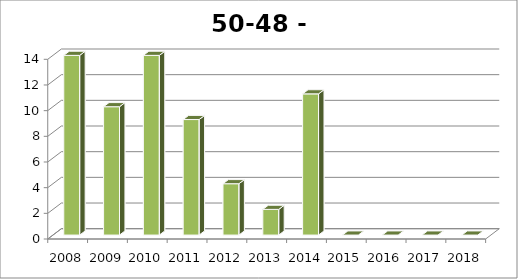
| Category | Esbeek |
|---|---|
| 2008.0 | 14 |
| 2009.0 | 10 |
| 2010.0 | 14 |
| 2011.0 | 9 |
| 2012.0 | 4 |
| 2013.0 | 2 |
| 2014.0 | 11 |
| 2015.0 | 0 |
| 2016.0 | 0 |
| 2017.0 | 0 |
| 2018.0 | 0 |